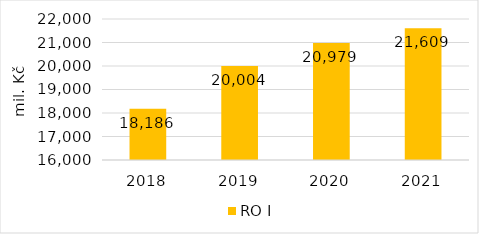
| Category | RO I |
|---|---|
| 2018.0 | 18186.023 |
| 2019.0 | 20004.059 |
| 2020.0 | 20978.859 |
| 2021.0 | 21608.859 |